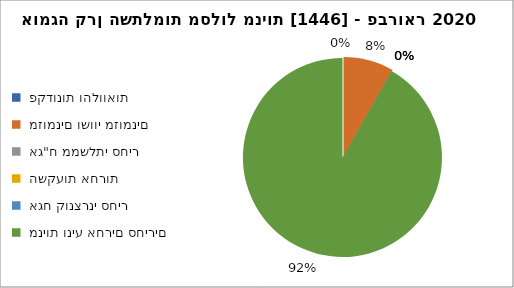
| Category | אומגה קרן השתלמות מסלול מניות [1446] - פברואר 2020 |
|---|---|
|  פקדונות והלוואות  | 0 |
|  מזומנים ושווי מזומנים   | 1832 |
|  אג"ח ממשלתי סחיר  | 0 |
|  השקעות אחרות  | 0 |
|  אגח קונצרני סחיר  | 0 |
|  מניות וניע אחרים סחירים   | 20514 |